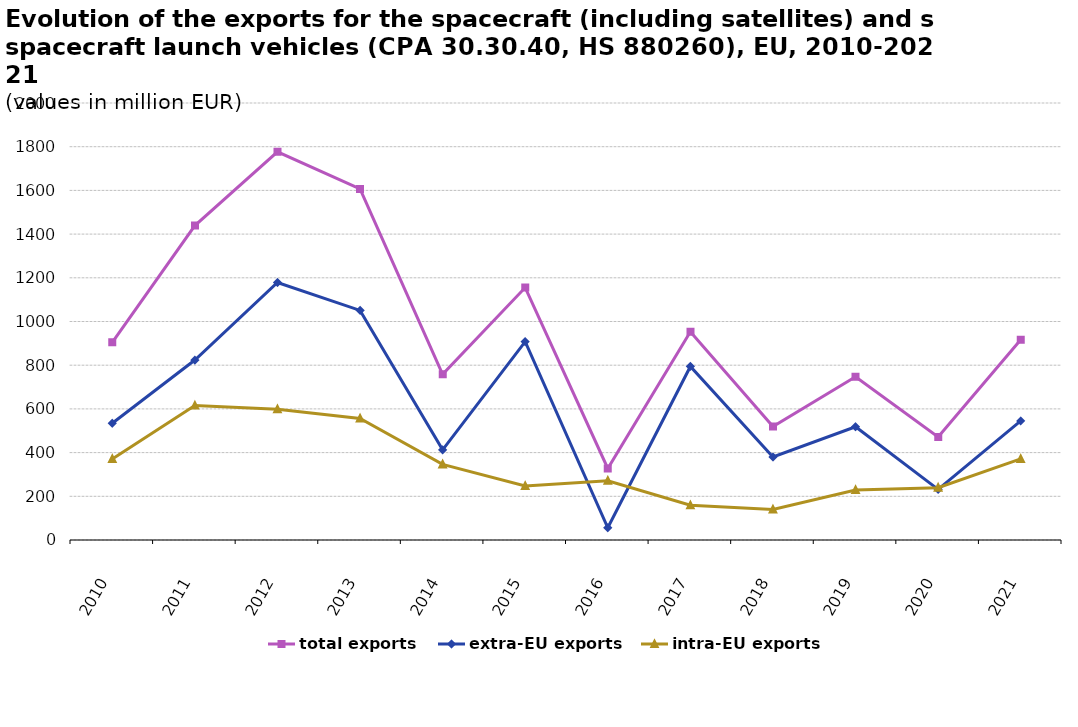
| Category | total exports | extra-EU exports | intra-EU exports |
|---|---|---|---|
| 2010.0 | 904.942 | 534.085 | 370.857 |
| 2011.0 | 1438.848 | 823.618 | 615.231 |
| 2012.0 | 1776.844 | 1178.56 | 598.284 |
| 2013.0 | 1606.86 | 1050.793 | 556.068 |
| 2014.0 | 758.525 | 412.502 | 346.023 |
| 2015.0 | 1155.23 | 907.942 | 247.288 |
| 2016.0 | 327.35 | 56.129 | 271.222 |
| 2017.0 | 953.072 | 794.133 | 158.94 |
| 2018.0 | 519.241 | 379.779 | 139.462 |
| 2019.0 | 747.439 | 518.356 | 229.083 |
| 2020.0 | 471.027 | 231.376 | 239.651 |
| 2021.0 | 916.086 | 544.985 | 371.1 |